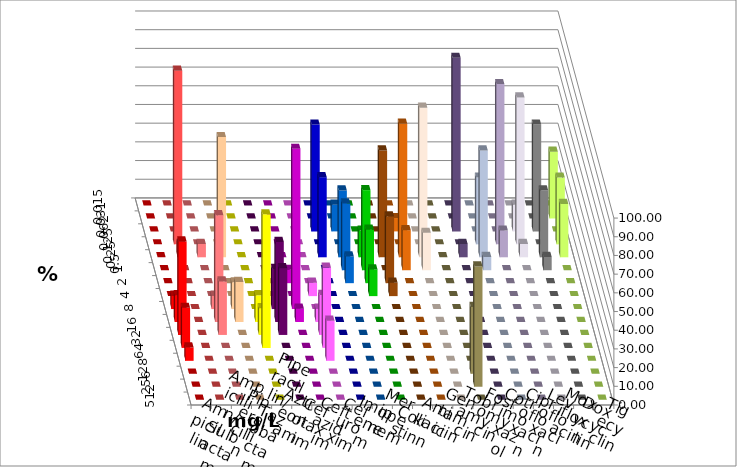
| Category | Ampicillin | Ampicillin/ Sulbactam | Piperacillin | Piperacillin/ Tazobactam | Aztreonam | Cefotaxim | Ceftazidim | Cefuroxim | Imipenem | Meropenem | Colistin | Amikacin | Gentamicin | Tobramycin | Fosfomycin | Cotrimoxazol | Ciprofloxacin | Levofloxacin | Moxifloxacin | Doxycyclin | Tigecyclin |
|---|---|---|---|---|---|---|---|---|---|---|---|---|---|---|---|---|---|---|---|---|---|
| 0.015 | 0 | 0 | 0 | 0 | 0 | 0 | 0 | 0 | 0 | 0 | 0 | 0 | 0 | 0 | 0 | 0 | 0 | 0 | 0 | 0 | 0 |
| 0.031 | 0 | 0 | 0 | 0 | 0 | 0 | 0 | 0 | 0 | 0 | 0 | 0 | 0 | 0 | 0 | 0 | 0 | 0 | 0 | 0 | 35.714 |
| 0.062 | 0 | 0 | 0 | 0 | 0 | 0 | 0 | 0 | 57.143 | 14.286 | 0 | 0 | 7.143 | 0 | 0 | 92.857 | 0 | 0 | 14.286 | 57.143 | 0 |
| 0.125 | 0 | 92.857 | 0 | 0 | 0 | 0 | 0 | 0 | 0 | 0 | 0 | 0 | 0 | 0 | 0 | 0 | 35.714 | 85.714 | 78.571 | 0 | 35.714 |
| 0.25 | 0 | 7.143 | 7.143 | 64.286 | 0 | 0 | 0 | 0 | 42.857 | 35.714 | 14.286 | 57.143 | 71.429 | 80 | 0 | 7.143 | 57.143 | 14.286 | 7.143 | 35.714 | 28.571 |
| 0.5 | 0 | 0 | 0 | 0 | 0 | 0 | 0 | 0 | 0 | 35.714 | 42.857 | 0 | 21.429 | 20 | 0 | 0 | 7.143 | 0 | 0 | 7.143 | 0 |
| 1.0 | 0 | 0 | 0 | 0 | 0 | 0 | 7.143 | 0 | 0 | 14.286 | 28.571 | 35.714 | 0 | 0 | 0 | 0 | 0 | 0 | 0 | 0 | 0 |
| 2.0 | 0 | 0 | 0 | 0 | 0 | 0 | 0 | 7.143 | 0 | 0 | 14.286 | 7.143 | 0 | 0 | 0 | 0 | 0 | 0 | 0 | 0 | 0 |
| 4.0 | 7.143 | 0 | 7.143 | 14.286 | 0 | 21.429 | 85.714 | 0 | 0 | 0 | 0 | 0 | 0 | 0 | 0 | 0 | 0 | 0 | 0 | 0 | 0 |
| 8.0 | 14.286 | 0 | 57.143 | 21.429 | 14.286 | 42.857 | 7.143 | 7.143 | 0 | 0 | 0 | 0 | 0 | 0 | 0 | 0 | 0 | 0 | 0 | 0 | 0 |
| 16.0 | 50 | 0 | 28.571 | 0 | 14.286 | 35.714 | 0 | 21.429 | 0 | 0 | 0 | 0 | 0 | 0 | 0 | 0 | 0 | 0 | 0 | 0 | 0 |
| 32.0 | 21.429 | 0 | 0 | 0 | 71.429 | 0 | 0 | 42.857 | 0 | 0 | 0 | 0 | 0 | 0 | 0 | 0 | 0 | 0 | 0 | 0 | 0 |
| 64.0 | 7.143 | 0 | 0 | 0 | 0 | 0 | 0 | 21.429 | 0 | 0 | 0 | 0 | 0 | 0 | 0 | 0 | 0 | 0 | 0 | 0 | 0 |
| 128.0 | 0 | 0 | 0 | 0 | 0 | 0 | 0 | 0 | 0 | 0 | 0 | 0 | 0 | 0 | 35.714 | 0 | 0 | 0 | 0 | 0 | 0 |
| 256.0 | 0 | 0 | 0 | 0 | 0 | 0 | 0 | 0 | 0 | 0 | 0 | 0 | 0 | 0 | 64.286 | 0 | 0 | 0 | 0 | 0 | 0 |
| 512.0 | 0 | 0 | 0 | 0 | 0 | 0 | 0 | 0 | 0 | 0 | 0 | 0 | 0 | 0 | 0 | 0 | 0 | 0 | 0 | 0 | 0 |